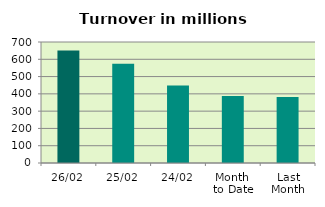
| Category | Series 0 |
|---|---|
| 26/02 | 650.392 |
| 25/02 | 574.509 |
| 24/02 | 449.021 |
| Month 
to Date | 387.65 |
| Last
Month | 381.872 |